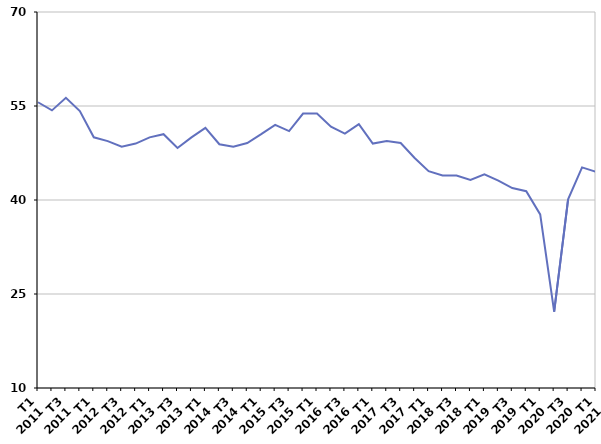
| Category | Autre cas |
|---|---|
| T1
2011 | 55.6 |
| T2
2011 | 54.3 |
| T3
2011 | 56.3 |
| T4
2011 | 54.2 |
| T1
2012 | 50 |
| T2
2012 | 49.4 |
| T3
2012 | 48.5 |
| T4
2012 | 49 |
| T1
2013 | 50 |
| T2
2013 | 50.5 |
| T3
2013 | 48.3 |
| T4
2013 | 50 |
| T1
2014 | 51.5 |
| T2
2014 | 48.9 |
| T3
2014 | 48.5 |
| T4
2014 | 49.1 |
| T1
2015 | 50.5 |
| T2
2015 | 52 |
| T3
2015 | 51 |
| T4
2015 | 53.8 |
| T1
2016 | 53.8 |
| T2
2016 | 51.7 |
| T3
2016 | 50.6 |
| T4
2016 | 52.1 |
| T1
2017 | 49 |
| T2
2017 | 49.4 |
| T3
2017 | 49.1 |
| T4
2017 | 46.7 |
| T1
2018 | 44.6 |
| T2
2018 | 43.9 |
| T3
2018 | 43.9 |
| T4
2018 | 43.2 |
| T1
2019 | 44.1 |
| T2
2019 | 43.1 |
| T3
2019 | 41.9 |
| T4
2019 | 41.4 |
| T1
2020 | 37.7 |
| T2
2020 | 22.2 |
| T3
2020 | 40.1 |
| T4
2020 | 45.2 |
| T1
2021 | 44.5 |